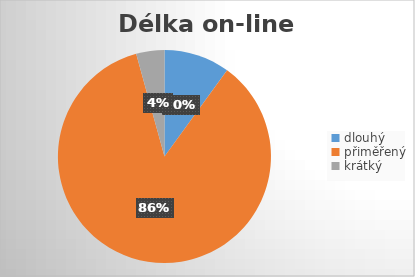
| Category | Series 0 |
|---|---|
| dlouhý | 7 |
| přiměřený | 60 |
| krátký | 3 |